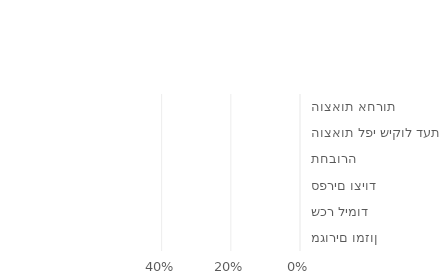
| Category | Series 0 |
|---|---|
| מגורים ומזון | 0 |
| שכר לימוד | 0 |
| ספרים וציוד | 0 |
| תחבורה | 0 |
| הוצאות לפי שיקול דעת | 0 |
| הוצאות אחרות | 0 |